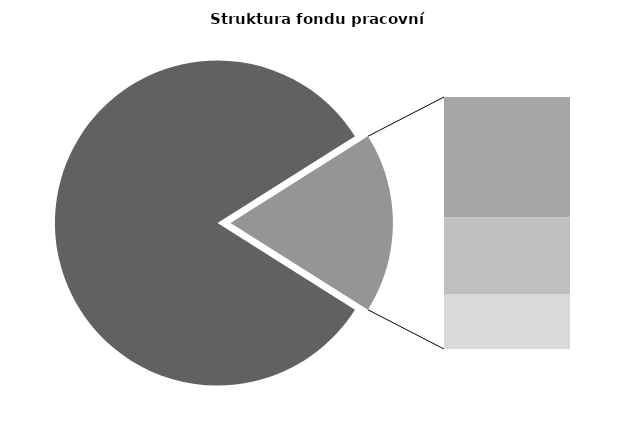
| Category | Series 0 |
|---|---|
| Průměrná měsíční odpracovaná doba bez přesčasu | 139.133 |
| Dovolená | 14.497 |
| Nemoc | 9.261 |
| Jiné | 6.628 |